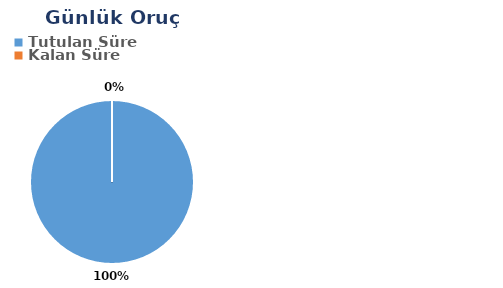
| Category | Günlük |
|---|---|
| Tutulan Süre | 0.592 |
| Kalan Süre | 0 |